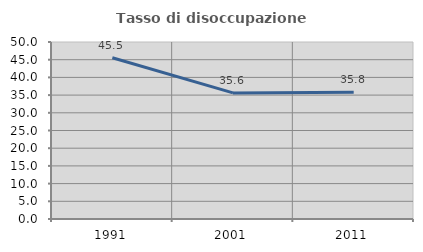
| Category | Tasso di disoccupazione giovanile  |
|---|---|
| 1991.0 | 45.536 |
| 2001.0 | 35.623 |
| 2011.0 | 35.835 |